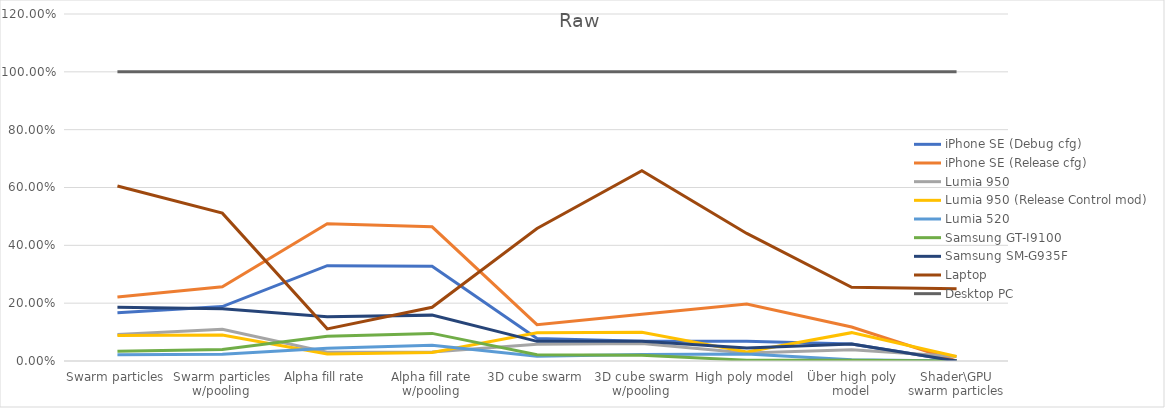
| Category | iPhone SE (Debug cfg) | iPhone SE (Release cfg) | Lumia 950 | Lumia 950 (Release Control mod) | Lumia 520 | Samsung GT-I9100 | Samsung SM-G935F | Laptop | Desktop PC |
|---|---|---|---|---|---|---|---|---|---|
| Swarm particles | 0.167 | 0.221 | 0.092 | 0.088 | 0.022 | 0.034 | 0.186 | 0.605 | 1 |
| Swarm particles w/pooling | 0.188 | 0.256 | 0.109 | 0.09 | 0.023 | 0.04 | 0.181 | 0.511 | 1 |
| Alpha fill rate | 0.33 | 0.475 | 0.03 | 0.024 | 0.044 | 0.086 | 0.153 | 0.111 | 1 |
| Alpha fill rate w/pooling | 0.327 | 0.464 | 0.031 | 0.029 | 0.054 | 0.096 | 0.159 | 0.186 | 1 |
| 3D cube swarm | 0.078 | 0.126 | 0.058 | 0.098 | 0.016 | 0.021 | 0.068 | 0.458 | 1 |
| 3D cube swarm w/pooling | 0.068 | 0.162 | 0.061 | 0.099 | 0.023 | 0.02 | 0.068 | 0.658 | 1 |
| High poly model | 0.069 | 0.197 | 0.028 | 0.031 | 0.024 | 0.003 | 0.045 | 0.441 | 1 |
| Über high poly model | 0.059 | 0.118 | 0.039 | 0.098 | 0.004 | 0.003 | 0.059 | 0.255 | 1 |
| Shader\GPU swarm particles | 0 | 0 | 0.016 | 0.016 | 0 | 0 | 0 | 0.25 | 1 |